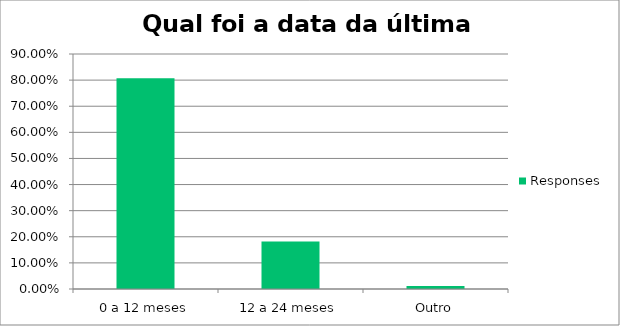
| Category | Responses |
|---|---|
| 0 a 12 meses | 0.807 |
| 12 a 24 meses | 0.182 |
| Outro | 0.011 |